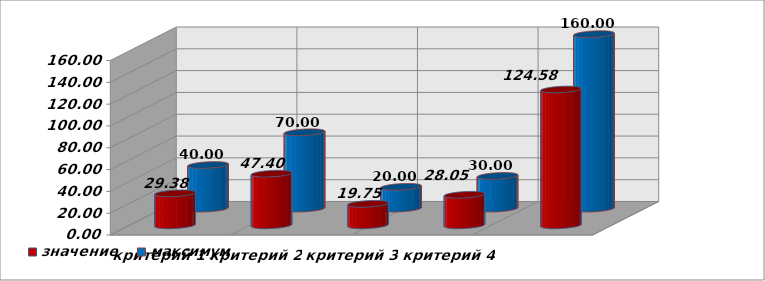
| Category | значение | максимум |
|---|---|---|
| критерий 1 | 29.38 | 40 |
| критерий 2 | 47.4 | 70 |
| критерий 3 | 19.75 | 20 |
| критерий 4 | 28.05 | 30 |